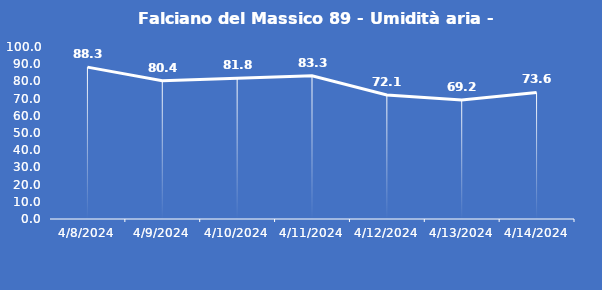
| Category | Falciano del Massico 89 - Umidità aria - Grezzo (%) |
|---|---|
| 4/8/24 | 88.3 |
| 4/9/24 | 80.4 |
| 4/10/24 | 81.8 |
| 4/11/24 | 83.3 |
| 4/12/24 | 72.1 |
| 4/13/24 | 69.2 |
| 4/14/24 | 73.6 |